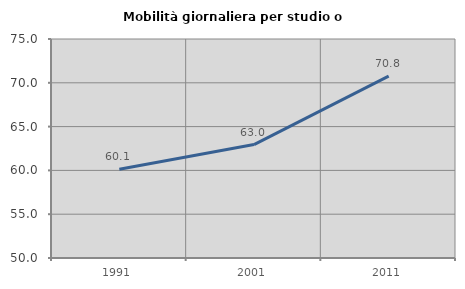
| Category | Mobilità giornaliera per studio o lavoro |
|---|---|
| 1991.0 | 60.122 |
| 2001.0 | 62.951 |
| 2011.0 | 70.755 |